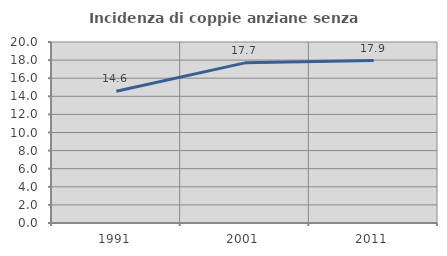
| Category | Incidenza di coppie anziane senza figli  |
|---|---|
| 1991.0 | 14.56 |
| 2001.0 | 17.694 |
| 2011.0 | 17.945 |